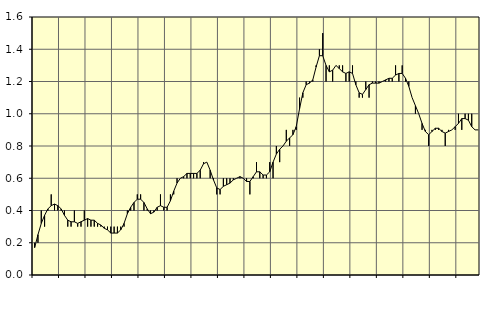
| Category | Piggar | Fast anställda utomlands |
|---|---|---|
| nan | 0.2 | 0.17 |
| 87.0 | 0.2 | 0.25 |
| 87.0 | 0.4 | 0.32 |
| 87.0 | 0.3 | 0.37 |
| nan | 0.4 | 0.41 |
| 88.0 | 0.5 | 0.43 |
| 88.0 | 0.4 | 0.44 |
| 88.0 | 0.4 | 0.43 |
| nan | 0.4 | 0.41 |
| 89.0 | 0.4 | 0.37 |
| 89.0 | 0.3 | 0.34 |
| 89.0 | 0.3 | 0.33 |
| nan | 0.4 | 0.33 |
| 90.0 | 0.3 | 0.32 |
| 90.0 | 0.3 | 0.33 |
| 90.0 | 0.4 | 0.34 |
| nan | 0.3 | 0.35 |
| 91.0 | 0.3 | 0.34 |
| 91.0 | 0.3 | 0.34 |
| 91.0 | 0.3 | 0.32 |
| nan | 0.3 | 0.31 |
| 92.0 | 0.3 | 0.29 |
| 92.0 | 0.3 | 0.28 |
| 92.0 | 0.3 | 0.26 |
| nan | 0.3 | 0.26 |
| 93.0 | 0.3 | 0.26 |
| 93.0 | 0.3 | 0.28 |
| 93.0 | 0.3 | 0.32 |
| nan | 0.4 | 0.38 |
| 94.0 | 0.4 | 0.42 |
| 94.0 | 0.4 | 0.45 |
| 94.0 | 0.5 | 0.47 |
| nan | 0.5 | 0.47 |
| 95.0 | 0.4 | 0.45 |
| 95.0 | 0.4 | 0.41 |
| 95.0 | 0.4 | 0.38 |
| nan | 0.4 | 0.39 |
| 96.0 | 0.4 | 0.42 |
| 96.0 | 0.5 | 0.43 |
| 96.0 | 0.4 | 0.42 |
| nan | 0.4 | 0.42 |
| 97.0 | 0.5 | 0.46 |
| 97.0 | 0.5 | 0.52 |
| 97.0 | 0.6 | 0.57 |
| nan | 0.6 | 0.6 |
| 98.0 | 0.6 | 0.61 |
| 98.0 | 0.6 | 0.63 |
| 98.0 | 0.6 | 0.63 |
| nan | 0.6 | 0.63 |
| 99.0 | 0.6 | 0.63 |
| 99.0 | 0.6 | 0.65 |
| 99.0 | 0.7 | 0.69 |
| nan | 0.7 | 0.7 |
| 0.0 | 0.6 | 0.65 |
| 0.0 | 0.6 | 0.59 |
| 0.0 | 0.5 | 0.54 |
| nan | 0.5 | 0.53 |
| 1.0 | 0.6 | 0.55 |
| 1.0 | 0.6 | 0.56 |
| 1.0 | 0.6 | 0.57 |
| nan | 0.6 | 0.59 |
| 2.0 | 0.6 | 0.6 |
| 2.0 | 0.6 | 0.61 |
| 2.0 | 0.6 | 0.6 |
| nan | 0.6 | 0.58 |
| 3.0 | 0.5 | 0.58 |
| 3.0 | 0.6 | 0.61 |
| 3.0 | 0.7 | 0.64 |
| nan | 0.6 | 0.64 |
| 4.0 | 0.6 | 0.62 |
| 4.0 | 0.6 | 0.62 |
| 4.0 | 0.7 | 0.64 |
| nan | 0.6 | 0.7 |
| 5.0 | 0.8 | 0.75 |
| 5.0 | 0.7 | 0.78 |
| 5.0 | 0.8 | 0.8 |
| nan | 0.9 | 0.83 |
| 6.0 | 0.8 | 0.85 |
| 6.0 | 0.9 | 0.87 |
| 6.0 | 0.9 | 0.92 |
| nan | 1.1 | 1.03 |
| 7.0 | 1.1 | 1.13 |
| 7.0 | 1.2 | 1.18 |
| 7.0 | 1.2 | 1.19 |
| nan | 1.2 | 1.21 |
| 8.0 | 1.3 | 1.29 |
| 8.0 | 1.4 | 1.36 |
| 8.0 | 1.5 | 1.36 |
| nan | 1.2 | 1.3 |
| 9.0 | 1.3 | 1.26 |
| 9.0 | 1.2 | 1.27 |
| 9.0 | 1.3 | 1.3 |
| nan | 1.3 | 1.28 |
| 10.0 | 1.3 | 1.26 |
| 10.0 | 1.2 | 1.25 |
| 10.0 | 1.2 | 1.26 |
| nan | 1.3 | 1.25 |
| 11.0 | 1.2 | 1.18 |
| 11.0 | 1.1 | 1.13 |
| 11.0 | 1.1 | 1.12 |
| nan | 1.2 | 1.15 |
| 12.0 | 1.1 | 1.18 |
| 12.0 | 1.2 | 1.19 |
| 12.0 | 1.2 | 1.19 |
| nan | 1.2 | 1.19 |
| 13.0 | 1.2 | 1.2 |
| 13.0 | 1.2 | 1.21 |
| 13.0 | 1.2 | 1.22 |
| nan | 1.2 | 1.22 |
| 14.0 | 1.3 | 1.24 |
| 14.0 | 1.2 | 1.25 |
| 14.0 | 1.3 | 1.25 |
| nan | 1.2 | 1.22 |
| 15.0 | 1.2 | 1.17 |
| 15.0 | 1.1 | 1.1 |
| 15.0 | 1 | 1.05 |
| nan | 1 | 1 |
| 16.0 | 0.9 | 0.94 |
| 16.0 | 0.9 | 0.89 |
| 16.0 | 0.8 | 0.87 |
| nan | 0.9 | 0.89 |
| 17.0 | 0.9 | 0.91 |
| 17.0 | 0.9 | 0.91 |
| 17.0 | 0.9 | 0.89 |
| nan | 0.8 | 0.88 |
| 18.0 | 0.9 | 0.89 |
| 18.0 | 0.9 | 0.9 |
| 18.0 | 0.9 | 0.92 |
| nan | 1 | 0.94 |
| 19.0 | 0.9 | 0.97 |
| 19.0 | 1 | 0.97 |
| 19.0 | 1 | 0.96 |
| nan | 1 | 0.92 |
| 20.0 | 0.9 | 0.9 |
| 20.0 | 0.9 | 0.9 |